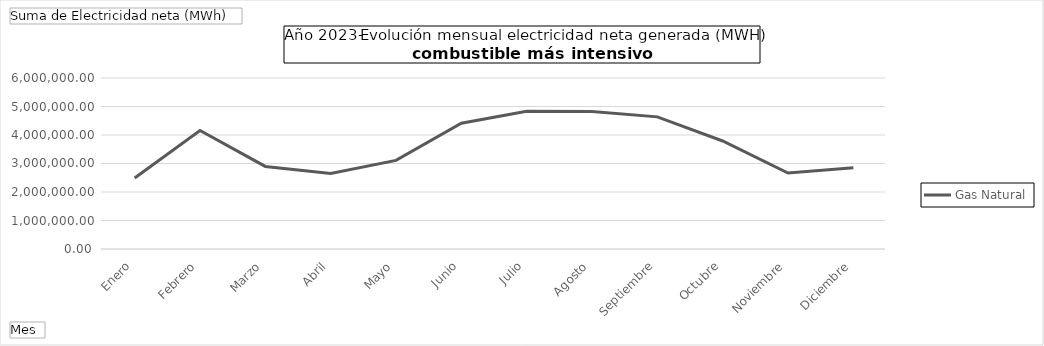
| Category | Gas Natural |
|---|---|
| Enero | 2493825.77 |
| Febrero | 4159380.69 |
| Marzo | 2897285.29 |
| Abril | 2648218.3 |
| Mayo | 3108107.21 |
| Junio | 4412231.15 |
| Julio | 4834005.43 |
| Agosto | 4821263.93 |
| Septiembre | 4636237 |
| Octubre | 3789836.87 |
| Noviembre | 2663651.33 |
| Diciembre | 2853563.12 |